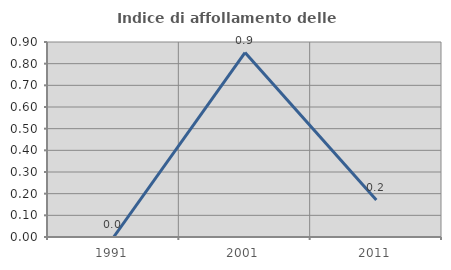
| Category | Indice di affollamento delle abitazioni  |
|---|---|
| 1991.0 | 0 |
| 2001.0 | 0.851 |
| 2011.0 | 0.171 |